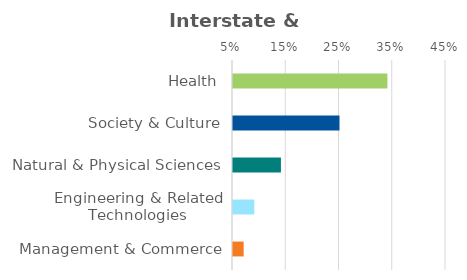
| Category | Series 0 |
|---|---|
| Health | 0.34 |
| Society & Culture | 0.25 |
| Natural & Physical Sciences | 0.14 |
| Engineering & Related Technologies | 0.09 |
| Management & Commerce | 0.07 |